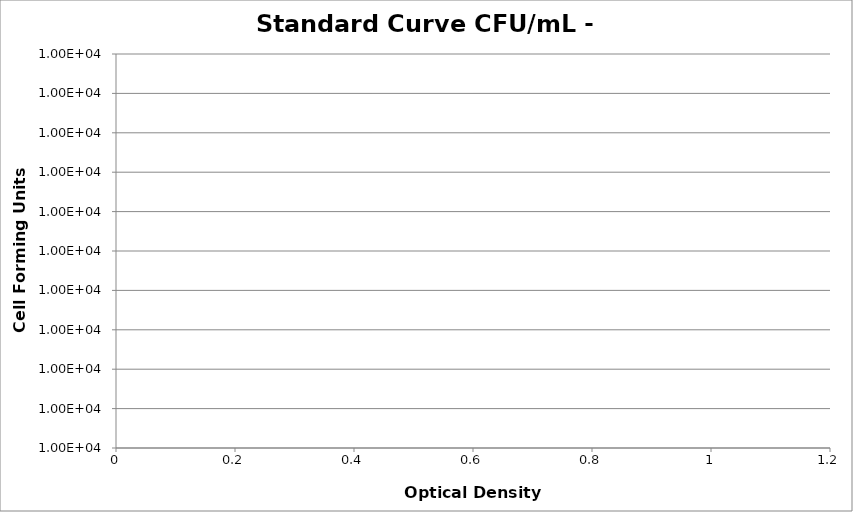
| Category | Series 0 |
|---|---|
|  | 0 |
|  | 0 |
|  | 0 |
|  | 0 |
|  | 0 |
|  | 0 |
|  | 0 |
|  | 0 |
|  | 0 |
|  | 0 |
|  | 0 |
|  | 0 |
|  | 0 |
|  | 0 |
|  | 0 |
|  | 0 |
|  | 0 |
|  | 0 |
|  | 0 |
|  | 0 |
|  | 0 |
|  | 0 |
|  | 0 |
|  | 0 |
|  | 0 |